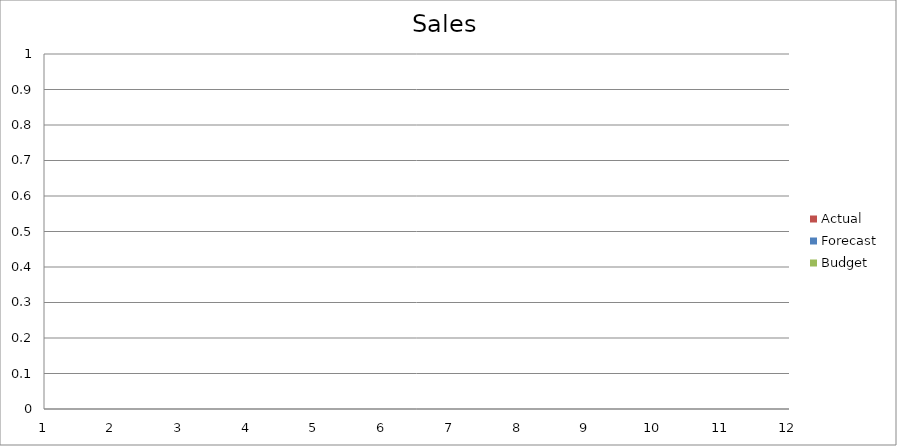
| Category | Budget | Forecast | Actual |
|---|---|---|---|
| 0 | 2670 | 1250 | 2950 |
| 1 | 720 | 3380 | 3030 |
| 2 | 3050 | 3270 | 2990 |
| 3 | 2730 | 2890 | 2720 |
| 4 | 1150 | 1940 | 610 |
| 5 | 2790 | 1320 | 1980 |
| 6 | 2370 | 3110 | 3360 |
| 7 | 1090 | 1220 | 1020 |
| 8 | 1040 | 890 | 650 |
| 9 | 3090 | 760 | 2440 |
| 10 | 2700 | 1140 | 2530 |
| 11 | 630 | 1080 | 2690 |